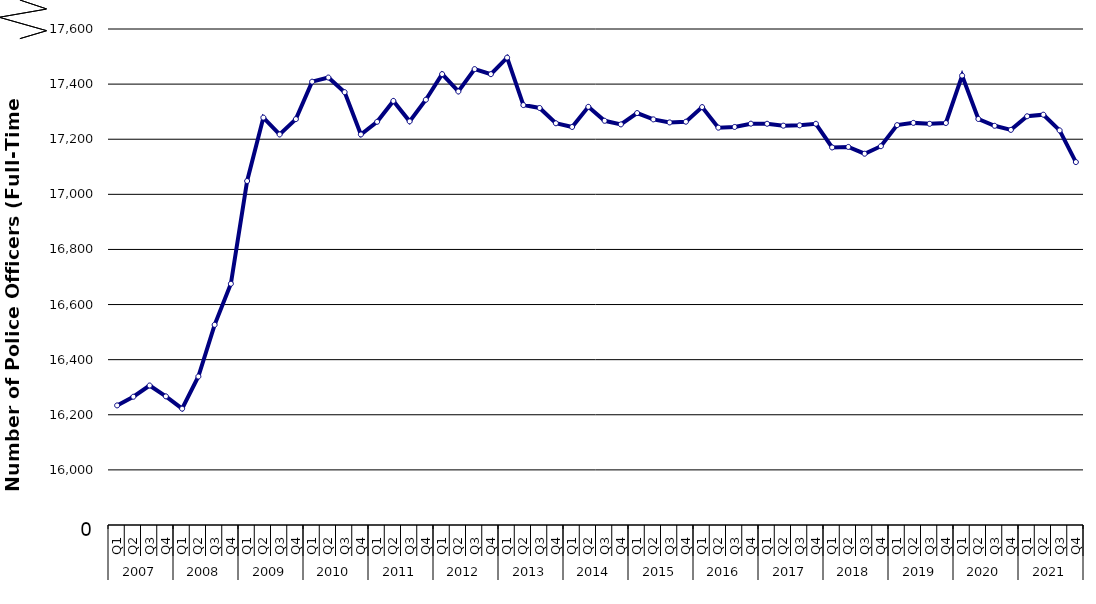
| Category | 16,234 |
|---|---|
| 0 | 16234.01 |
| 1 | 16265.424 |
| 2 | 16306.23 |
| 3 | 16266.83 |
| 4 | 16222.19 |
| 5 | 16338.88 |
| 6 | 16526.47 |
| 7 | 16675.42 |
| 8 | 17048.317 |
| 9 | 17278.475 |
| 10 | 17217.317 |
| 11 | 17272.965 |
| 12 | 17408.844 |
| 13 | 17423.865 |
| 14 | 17370.81 |
| 15 | 17217.24 |
| 16 | 17263.27 |
| 17 | 17338.988 |
| 18 | 17264.812 |
| 19 | 17343.33 |
| 20 | 17436.29 |
| 21 | 17373.25 |
| 22 | 17454.43 |
| 23 | 17436.122 |
| 24 | 17496.21 |
| 25 | 17323.9 |
| 26 | 17313.4 |
| 27 | 17257.889 |
| 28 | 17244.455 |
| 29 | 17317.552 |
| 30 | 17266.91 |
| 31 | 17253.783 |
| 32 | 17294.969 |
| 33 | 17272.006 |
| 34 | 17260.946 |
| 35 | 17263.489 |
| 36 | 17316.571 |
| 37 | 17241.94 |
| 38 | 17244.511 |
| 39 | 17256.457 |
| 40 | 17256.091 |
| 41 | 17249.163 |
| 42 | 17250.469 |
| 43 | 17256.069 |
| 44 | 17170.139 |
| 45 | 17172.084 |
| 46 | 17147.42 |
| 47 | 17174.61 |
| 48 | 17251.156 |
| 49 | 17259.306 |
| 50 | 17255.864 |
| 51 | 17258.82 |
| 52 | 17430.914 |
| 53 | 17273.436 |
| 54 | 17248.751 |
| 55 | 17233.841 |
| 56 | 17283.337 |
| 57 | 17289 |
| 58 | 17232 |
| 59 | 17117.012 |